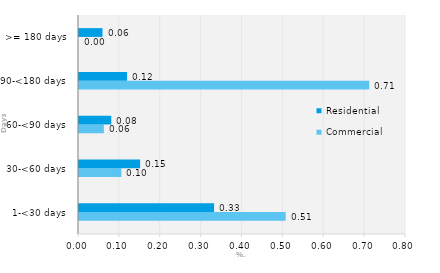
| Category | Commercial | Residential |
|---|---|---|
| 1-<30 days | 0.506 | 0.33 |
| 30-<60 days | 0.104 | 0.15 |
| 60-<90 days | 0.061 | 0.079 |
| 90-<180 days | 0.71 | 0.118 |
| >= 180 days | 0 | 0.058 |